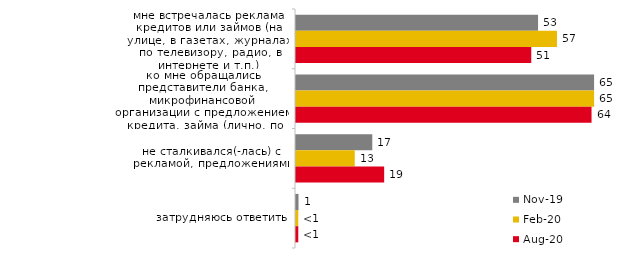
| Category | ноя.19 | фев.20 | авг.20 |
|---|---|---|---|
| мне встречалась реклама кредитов или займов (на улице, в газетах, журналах, по телевизору, радио, в интернете и т.п.) | 52.624 | 56.733 | 51.142 |
| ко мне обращались представители банка, микрофинансовой организации с предложением кредита, займа (лично, по телефону, через СМС, в офисе банка и т.п.) | 64.802 | 64.802 | 64.25 |
| не сталкивался(-лась) с рекламой, предложениями | 16.584 | 12.772 | 19.166 |
| затрудняюсь ответить | 0.545 | 0.495 | 0.497 |